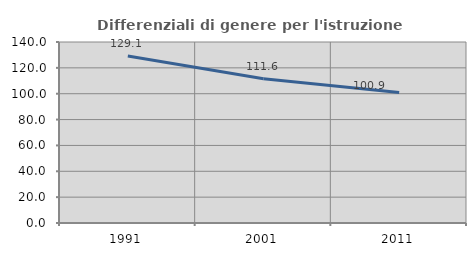
| Category | Differenziali di genere per l'istruzione superiore |
|---|---|
| 1991.0 | 129.122 |
| 2001.0 | 111.57 |
| 2011.0 | 100.879 |